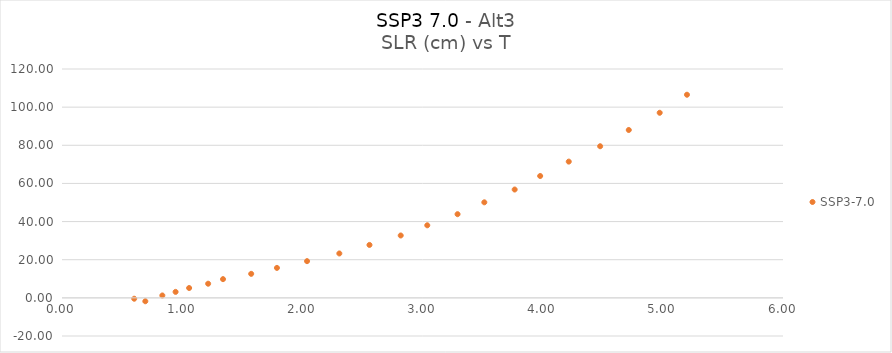
| Category | SSP3-7.0 |
|---|---|
| 0.693400617 | -1.781 |
| 0.600872844 | -0.455 |
| 0.835003234 | 1.253 |
| 0.945258389 | 3.132 |
| 1.057970477 | 5.16 |
| 1.216178519 | 7.412 |
| 1.339886213 | 9.814 |
| 1.574395123 | 12.59 |
| 1.788681887 | 15.708 |
| 2.03919685 | 19.253 |
| 2.307893697 | 23.276 |
| 2.558763346 | 27.749 |
| 2.818768923 | 32.702 |
| 3.039672772 | 38.049 |
| 3.291735705 | 43.87 |
| 3.514460709 | 50.096 |
| 3.767046903 | 56.806 |
| 3.979217691 | 63.898 |
| 4.217098748 | 71.442 |
| 4.478363862 | 79.501 |
| 4.716542417 | 88.017 |
| 4.97392585 | 97.047 |
| 5.200915883 | 106.507 |